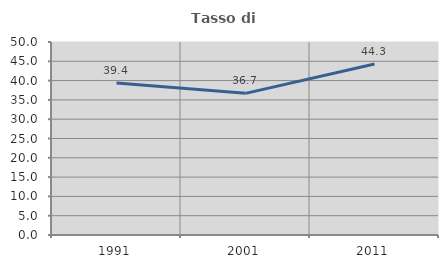
| Category | Tasso di occupazione   |
|---|---|
| 1991.0 | 39.357 |
| 2001.0 | 36.697 |
| 2011.0 | 44.279 |